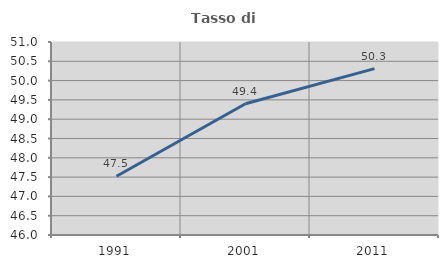
| Category | Tasso di occupazione   |
|---|---|
| 1991.0 | 47.523 |
| 2001.0 | 49.401 |
| 2011.0 | 50.311 |